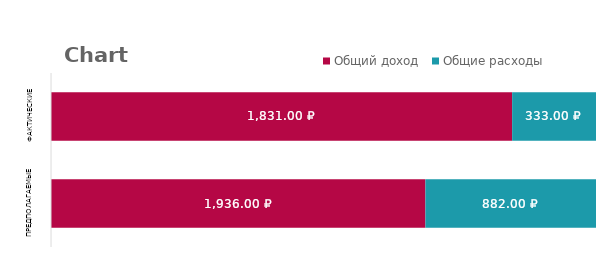
| Category | Общий доход | Общие расходы |
|---|---|---|
| Предполагаемые | 1936 | 882 |
| Фактические | 1831 | 333 |